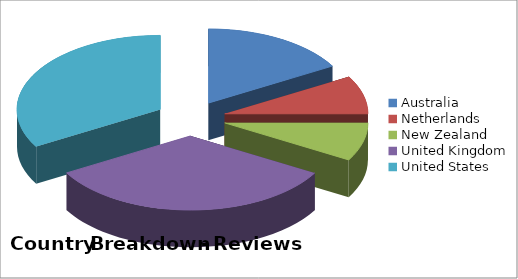
| Category | Series 1 | Series 0 |
|---|---|---|
| Australia | 0.167 | 4 |
| Netherlands | 0.083 | 2 |
| New Zealand | 0.083 | 2 |
| United Kingdom | 0.333 | 8 |
| United States | 0.333 | 8 |